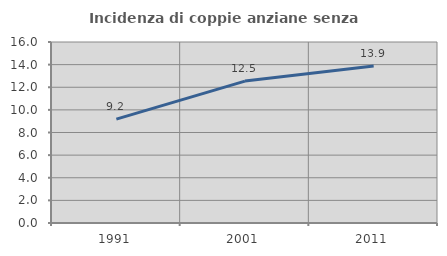
| Category | Incidenza di coppie anziane senza figli  |
|---|---|
| 1991.0 | 9.184 |
| 2001.0 | 12.545 |
| 2011.0 | 13.876 |